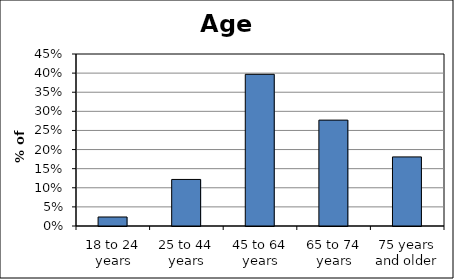
| Category | Series 0 |
|---|---|
| 18 to 24 years | 0.024 |
| 25 to 44 years | 0.122 |
| 45 to 64 years | 0.397 |
| 65 to 74 years | 0.277 |
| 75 years and older | 0.181 |